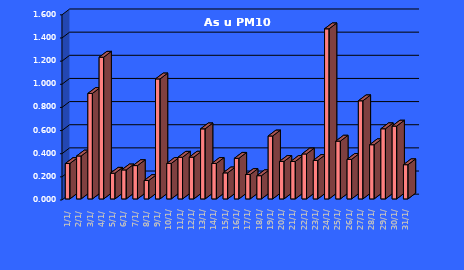
| Category | As u PM10 [ng/m3] |
|---|---|
| 2023-01-01 | 0.306 |
| 2023-01-02 | 0.371 |
| 2023-01-03 | 0.911 |
| 2023-01-04 | 1.224 |
| 2023-01-05 | 0.222 |
| 2023-01-06 | 0.251 |
| 2023-01-07 | 0.288 |
| 2023-01-08 | 0.159 |
| 2023-01-09 | 1.037 |
| 2023-01-10 | 0.307 |
| 2023-01-11 | 0.36 |
| 2023-01-12 | 0.361 |
| 2023-01-13 | 0.605 |
| 2023-01-14 | 0.307 |
| 2023-01-15 | 0.225 |
| 2023-01-16 | 0.351 |
| 2023-01-17 | 0.211 |
| 2023-01-18 | 0.201 |
| 2023-01-19 | 0.544 |
| 2023-01-20 | 0.324 |
| 2023-01-21 | 0.324 |
| 2023-01-22 | 0.389 |
| 2023-01-23 | 0.332 |
| 2023-01-24 | 1.47 |
| 2023-01-25 | 0.499 |
| 2023-01-26 | 0.342 |
| 2023-01-27 | 0.848 |
| 2023-01-28 | 0.468 |
| 2023-01-29 | 0.606 |
| 2023-01-30 | 0.629 |
| 2023-01-31 | 0.296 |